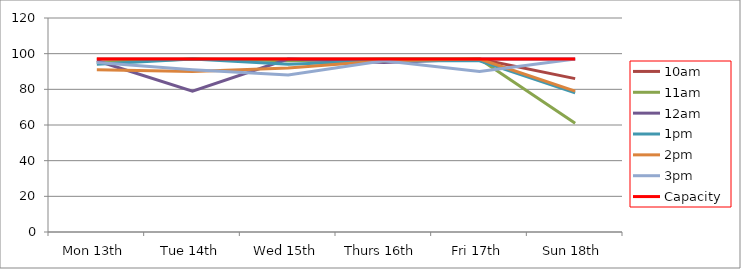
| Category | 9am | 10am | 11am | 12am | 1pm | 2pm | 3pm | 4pm | 5pm | Capacity |
|---|---|---|---|---|---|---|---|---|---|---|
| Mon 13th |  | 97 | 95 | 96 | 94 | 91 | 95 |  |  | 97 |
| Tue 14th |  | 97 | 97 | 79 | 97 | 90 | 91 |  |  | 97 |
| Wed 15th |  | 97 | 96 | 97 | 94 | 92 | 88 |  |  | 97 |
| Thurs 16th |  | 97 | 97 | 95 | 96 | 96 | 96 |  |  | 97 |
| Fri 17th |  | 97 | 97 | 97 | 96 | 97 | 90 |  |  | 97 |
| Sun 18th |  | 86 | 61 | 97 | 78 | 79 | 97 |  |  | 97 |